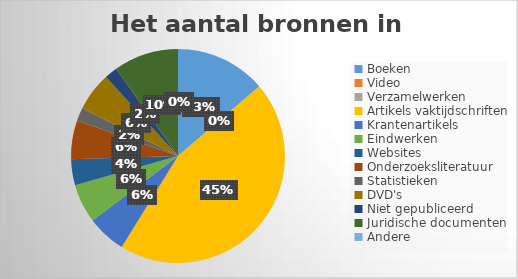
| Category | Series 0 |
|---|---|
| Boeken | 0.137 |
| Video | 0 |
| Verzamelwerken | 0 |
| Artikels vaktijdschriften | 0.451 |
| Krantenartikels | 0.059 |
| Eindwerken | 0.059 |
| Websites | 0.039 |
| Onderzoeksliteratuur | 0.059 |
| Statistieken | 0.02 |
| DVD's | 0.059 |
| Niet gepubliceerd | 0.02 |
| Juridische documenten | 0.098 |
| Andere | 0 |